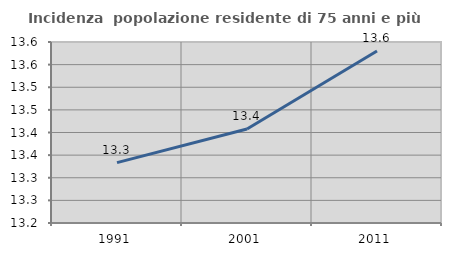
| Category | Incidenza  popolazione residente di 75 anni e più |
|---|---|
| 1991.0 | 13.333 |
| 2001.0 | 13.408 |
| 2011.0 | 13.58 |